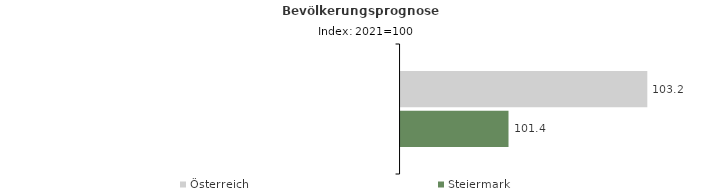
| Category | Österreich | Steiermark |
|---|---|---|
| 2021.0 | 103.2 | 101.4 |